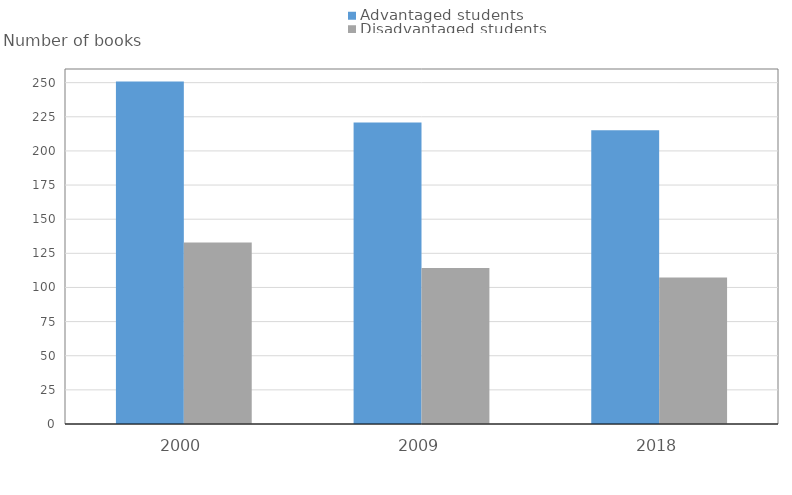
| Category | Advantaged students | Disadvantaged students |
|---|---|---|
| 2000.0 | 250.782 | 132.926 |
| 2009.0 | 220.763 | 114.164 |
| 2018.0 | 215.096 | 107.208 |